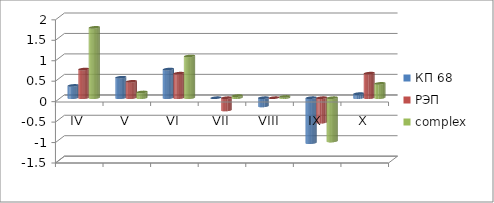
| Category | КП 68 | РЭП  | complex |
|---|---|---|---|
| IV | 0.3 | 0.7 | 1.72 |
| V | 0.5 | 0.4 | 0.14 |
| VI | 0.7 | 0.6 | 1.02 |
| VII | 0 | -0.3 | 0.05 |
| VIII | -0.2 | 0 | 0.03 |
| IX | -1.1 | -0.6 | -1.06 |
| X | 0.1 | 0.6 | 0.35 |